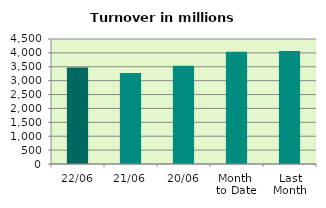
| Category | Series 0 |
|---|---|
| 22/06 | 3477.511 |
| 21/06 | 3276.317 |
| 20/06 | 3533.281 |
| Month 
to Date | 4044.254 |
| Last
Month | 4067.502 |